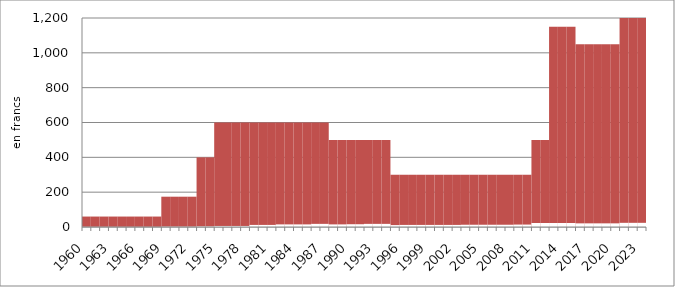
| Category | Personnes sans activité lucrative |
|---|---|
| 1960 | 1.2 |
| 1961 | 1.2 |
| 1962 | 1.2 |
| 1963 | 1.2 |
| 1964 | 1.2 |
| 1965 | 1.2 |
| 1966 | 1.2 |
| 1967 | 1.2 |
| 1968 | 1.2 |
| 1969 | 2.4 |
| 1970 | 2.4 |
| 1971 | 2.4 |
| 1972 | 2.4 |
| 1973 | 4 |
| 1974 | 4 |
| 1975 | 6 |
| 1976 | 6 |
| 1977 | 6 |
| 1978 | 6 |
| 1979 | 12 |
| 1980 | 12 |
| 1981 | 12 |
| 1982 | 15 |
| 1983 | 15 |
| 1984 | 15 |
| 1985 | 15 |
| 1986 | 18 |
| 1987 | 18 |
| 1988 | 15 |
| 1989 | 15 |
| 1990 | 16 |
| 1991 | 16 |
| 1992 | 18 |
| 1993 | 18 |
| 1994 | 18 |
| 1995 | 11 |
| 1996 | 12 |
| 1997 | 12 |
| 1998 | 12 |
| 1999 | 12 |
| 2000 | 12 |
| 2001 | 12 |
| 2002 | 12 |
| 2003 | 13 |
| 2004 | 13 |
| 2005 | 13 |
| 2006 | 13 |
| 2007 | 13 |
| 2008 | 13 |
| 2009 | 14 |
| 2010 | 14 |
| 2011 | 23 |
| 2012 | 23 |
| 2013 | 23 |
| 2014 | 23 |
| 2015 | 23 |
| 2016 | 21 |
| 2017 | 21 |
| 2018 | 21 |
| 2019 | 21 |
| 2020 | 21 |
| 2021 | 24 |
| 2022 | 24 |
| 2023 | 24 |